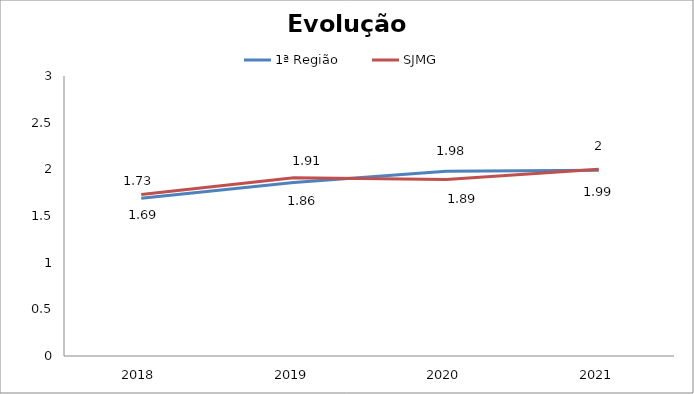
| Category | 1ª Região | SJMG |
|---|---|---|
| 0 | 1.69 | 1.73 |
| 1 | 1.86 | 1.91 |
| 2 | 1.98 | 1.89 |
| 3 | 1.99 | 2 |